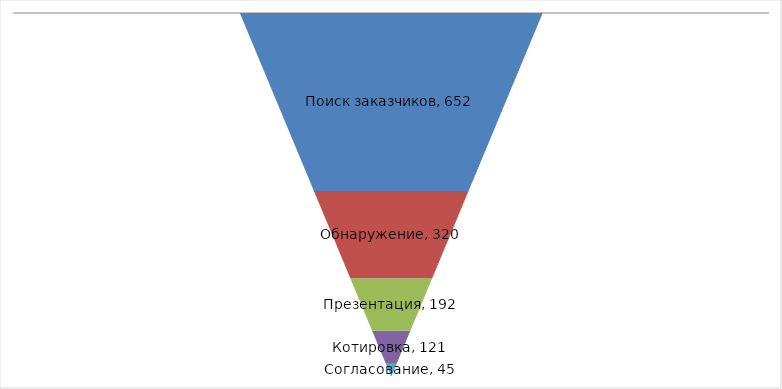
| Category | Поиск заказчиков | Обнаружение | Презентация | Котировка | Согласование |
|---|---|---|---|---|---|
| 0 | 652 | 320 | 192 | 121 | 45 |